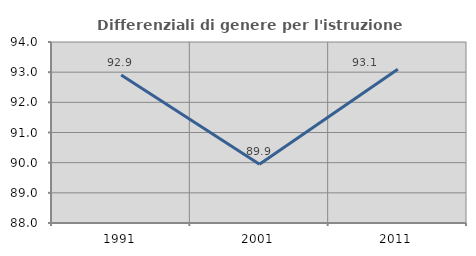
| Category | Differenziali di genere per l'istruzione superiore |
|---|---|
| 1991.0 | 92.908 |
| 2001.0 | 89.945 |
| 2011.0 | 93.094 |